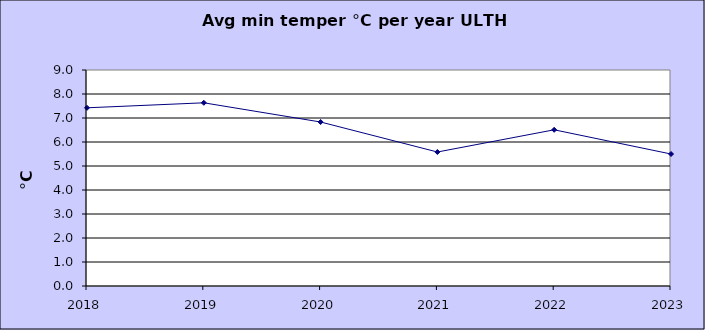
| Category | Series 0 |
|---|---|
| 2018.0 | 7.425 |
| 2019.0 | 7.633 |
| 2020.0 | 6.833 |
| 2021.0 | 5.583 |
| 2022.0 | 6.508 |
| 2023.0 | 5.5 |